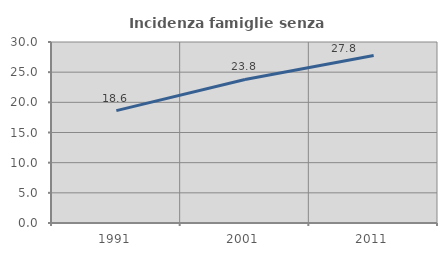
| Category | Incidenza famiglie senza nuclei |
|---|---|
| 1991.0 | 18.62 |
| 2001.0 | 23.794 |
| 2011.0 | 27.757 |